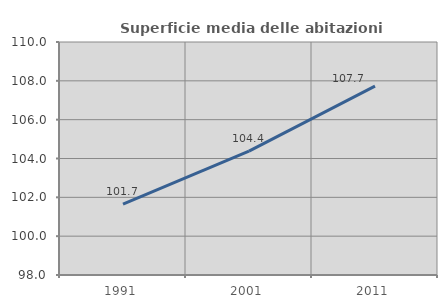
| Category | Superficie media delle abitazioni occupate |
|---|---|
| 1991.0 | 101.652 |
| 2001.0 | 104.376 |
| 2011.0 | 107.724 |